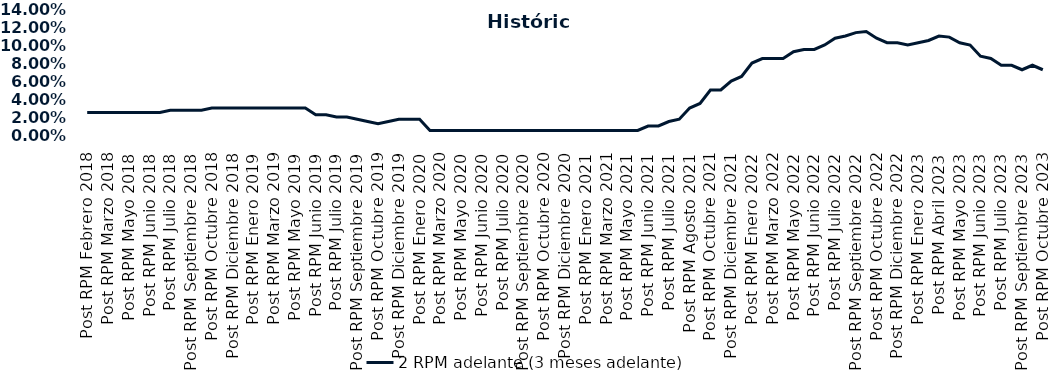
| Category | 2 RPM adelante (3 meses adelante) |
|---|---|
| Post RPM Febrero 2018 | 0.025 |
| Pre RPM Marzo 2018 | 0.025 |
| Post RPM Marzo 2018 | 0.025 |
| Pre RPM Mayo 2018 | 0.025 |
| Post RPM Mayo 2018 | 0.025 |
| Pre RPM Junio 2018 | 0.025 |
| Post RPM Junio 2018 | 0.025 |
| Pre RPM Julio 2018 | 0.025 |
| Post RPM Julio 2018 | 0.028 |
| Pre RPM Septiembre 2018 | 0.028 |
| Post RPM Septiembre 2018 | 0.028 |
| Pre RPM Octubre 2018 | 0.028 |
| Post RPM Octubre 2018 | 0.03 |
| Pre RPM Diciembre 2018 | 0.03 |
| Post RPM Diciembre 2018 | 0.03 |
| Pre RPM Enero 2019 | 0.03 |
| Post RPM Enero 2019 | 0.03 |
| Pre RPM Marzo 2019 | 0.03 |
| Post RPM Marzo 2019 | 0.03 |
| Pre RPM Mayo 2019 | 0.03 |
| Post RPM Mayo 2019 | 0.03 |
| Pre RPM Junio 2019 | 0.03 |
| Post RPM Junio 2019 | 0.022 |
| Pre RPM Julio 2019 | 0.022 |
| Post RPM Julio 2019 | 0.02 |
| Pre RPM Septiembre 2019 | 0.02 |
| Post RPM Septiembre 2019 | 0.018 |
| Pre RPM Octubre 2019 | 0.015 |
| Post RPM Octubre 2019 | 0.012 |
| Pre RPM Diciembre 2019 | 0.015 |
| Post RPM Diciembre 2019 | 0.018 |
| Pre RPM Enero 2020 | 0.018 |
| Post RPM Enero 2020 | 0.018 |
| Pre RPM Marzo 2020 | 0.005 |
| Post RPM Marzo 2020 | 0.005 |
| Pre RPM Mayo 2020 | 0.005 |
| Post RPM Mayo 2020 | 0.005 |
| Pre RPM Junio 2020 | 0.005 |
| Post RPM Junio 2020 | 0.005 |
| Pre RPM Julio 2020 | 0.005 |
| Post RPM Julio 2020 | 0.005 |
| Pre RPM Septiembre 2020 | 0.005 |
| Post RPM Septiembre 2020 | 0.005 |
| Pre RPM Octubre 2020 | 0.005 |
| Post RPM Octubre 2020 | 0.005 |
| Pre RPM Diciembre 2020 | 0.005 |
| Post RPM Diciembre 2020 | 0.005 |
| Pre RPM Enero 2021 | 0.005 |
| Post RPM Enero 2021 | 0.005 |
| Pre RPM Marzo 2021 | 0.005 |
| Post RPM Marzo 2021 | 0.005 |
| Pre RPM Mayo 2021 | 0.005 |
| Post RPM Mayo 2021 | 0.005 |
| Pre RPM Junio 2021 | 0.005 |
| Post RPM Junio 2021 | 0.01 |
| Pre RPM Julio 2021 | 0.01 |
| Post RPM Julio 2021 | 0.015 |
| Pre RPM Agosto 2021 | 0.018 |
| Post RPM Agosto 2021 | 0.03 |
| Pre RPM Octubre 2021 | 0.035 |
| Post RPM Octubre 2021 | 0.05 |
| Pre RPM Diciembre 2021 | 0.05 |
| Post RPM Diciembre 2021 | 0.06 |
| Pre RPM Enero 2022 | 0.065 |
| Post RPM Enero 2022 | 0.08 |
| Pre RPM Marzo 2022 | 0.085 |
| Post RPM Marzo 2022 | 0.085 |
| Pre RPM Mayo 2022 | 0.085 |
| Post RPM Mayo 2022 | 0.092 |
| Pre RPM Junio 2022 | 0.095 |
| Post RPM Junio 2022 | 0.095 |
| Pre RPM Julio 2022 | 0.1 |
| Post RPM Julio 2022 | 0.108 |
| Pre RPM Septiembre 2022 | 0.11 |
| Post RPM Septiembre 2022 | 0.114 |
| Pre RPM Octubre 2022 | 0.115 |
| Post RPM Octubre 2022 | 0.108 |
| Pre RPM Diciembre 2022 | 0.102 |
| Post RPM Diciembre 2022 | 0.102 |
| Pre RPM Enero 2023 | 0.1 |
| Post RPM Enero 2023 | 0.102 |
| Pre RPM Abril 2023 | 0.105 |
| Post RPM Abril 2023 | 0.11 |
| Pre RPM Mayo 2023 | 0.109 |
| Post RPM Mayo 2023 | 0.102 |
| Pre RPM Junio 2023 | 0.1 |
| Post RPM Junio 2023 | 0.088 |
| Pre RPM Julio 2023 | 0.085 |
| Post RPM Julio 2023 | 0.078 |
| Pre RPM Septiembre 2023 | 0.078 |
| Post RPM Septiembre 2023 | 0.072 |
| Pre RPM Octubre 2023 | 0.078 |
| Post RPM Octubre 2023 | 0.072 |